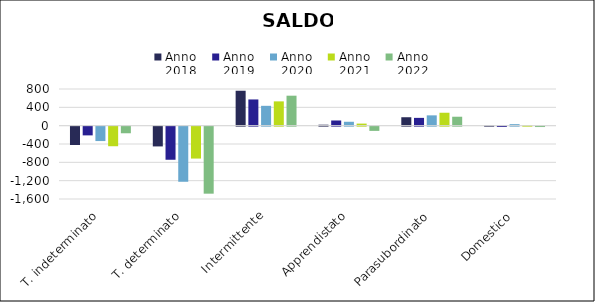
| Category | Anno
2018 | Anno
2019 | Anno
2020 | Anno
2021 | Anno
2022 |
|---|---|---|---|---|---|
| T. indeterminato | -400 | -190 | -314 | -427 | -144 |
| T. determinato | -431 | -722 | -1202 | -696 | -1462 |
| Intermittente | 762 | 572 | 433 | 530 | 654 |
| Apprendistato | 21 | 113 | 85 | 45 | -92 |
| Parasubordinato | 184 | 170 | 225 | 282 | 195 |
| Domestico | 5 | -6 | 33 | 10 | -8 |